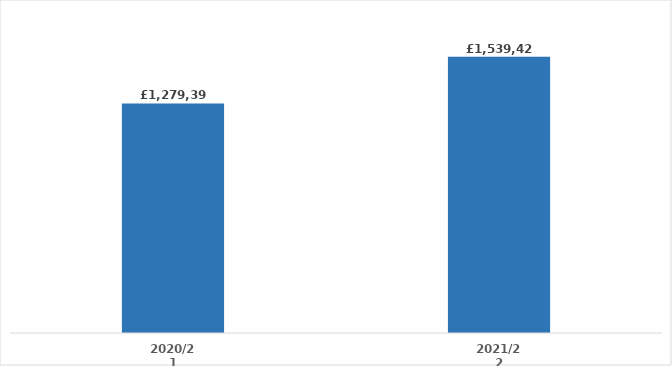
| Category | Series 0 |
|---|---|
| 2020/21 | 1279393.89 |
| 2021/22 | 1539425.62 |